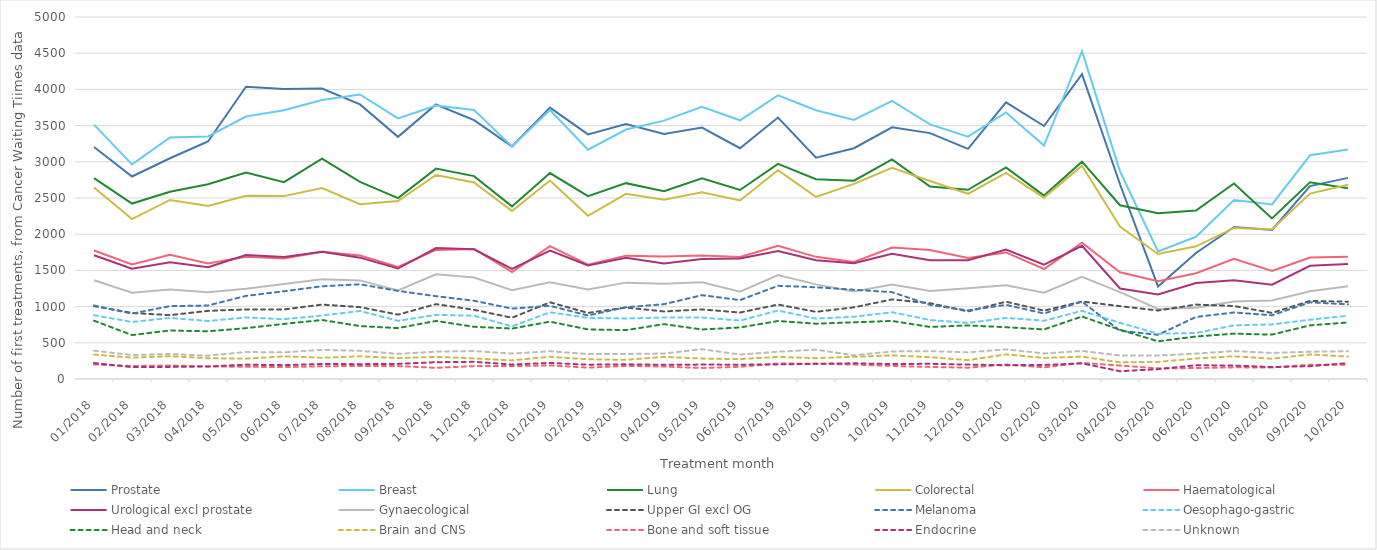
| Category | Prostate | Breast | Lung | Colorectal | Haematological | Urological excl prostate | Gynaecological | Upper GI excl OG | Melanoma | Oesophago-gastric | Head and neck | Brain and CNS | Bone and soft tissue | Endocrine | Unknown |
|---|---|---|---|---|---|---|---|---|---|---|---|---|---|---|---|
| 2018-01-01 | 3205 | 3514 | 2775 | 2646 | 1775 | 1709 | 1363 | 1007 | 1015 | 881 | 806 | 338 | 201 | 221 | 391 |
| 2018-02-01 | 2797 | 2965 | 2423 | 2208 | 1582 | 1522 | 1191 | 912 | 903 | 788 | 607 | 295 | 179 | 164 | 330 |
| 2018-03-01 | 3049 | 3335 | 2586 | 2473 | 1715 | 1614 | 1235 | 882 | 1006 | 843 | 670 | 315 | 187 | 167 | 345 |
| 2018-04-01 | 3280 | 3350 | 2690 | 2391 | 1596 | 1543 | 1198 | 941 | 1015 | 801 | 659 | 287 | 173 | 173 | 322 |
| 2018-05-01 | 4037 | 3625 | 2852 | 2531 | 1687 | 1712 | 1246 | 961 | 1148 | 850 | 702 | 281 | 169 | 198 | 373 |
| 2018-06-01 | 4005 | 3711 | 2719 | 2526 | 1664 | 1684 | 1313 | 960 | 1212 | 826 | 761 | 313 | 164 | 191 | 368 |
| 2018-07-01 | 4012 | 3853 | 3044 | 2637 | 1757 | 1758 | 1377 | 1028 | 1281 | 877 | 815 | 294 | 176 | 207 | 403 |
| 2018-08-01 | 3793 | 3930 | 2722 | 2414 | 1706 | 1676 | 1362 | 993 | 1308 | 939 | 731 | 313 | 180 | 205 | 389 |
| 2018-09-01 | 3345 | 3600 | 2499 | 2458 | 1549 | 1526 | 1224 | 889 | 1217 | 804 | 703 | 289 | 179 | 209 | 347 |
| 2018-10-01 | 3792 | 3778 | 2906 | 2817 | 1783 | 1808 | 1446 | 1034 | 1144 | 886 | 802 | 306 | 154 | 232 | 378 |
| 2018-11-01 | 3575 | 3716 | 2802 | 2715 | 1796 | 1791 | 1401 | 956 | 1081 | 874 | 721 | 284 | 178 | 237 | 386 |
| 2018-12-01 | 3213 | 3212 | 2384 | 2319 | 1476 | 1520 | 1225 | 846 | 972 | 728 | 697 | 257 | 179 | 200 | 351 |
| 2019-01-01 | 3748 | 3716 | 2845 | 2741 | 1835 | 1774 | 1337 | 1059 | 1011 | 921 | 792 | 307 | 188 | 222 | 383 |
| 2019-02-01 | 3379 | 3167 | 2525 | 2254 | 1580 | 1568 | 1236 | 913 | 877 | 845 | 685 | 272 | 157 | 197 | 345 |
| 2019-03-01 | 3523 | 3446 | 2705 | 2558 | 1704 | 1673 | 1331 | 987 | 992 | 836 | 675 | 265 | 181 | 203 | 345 |
| 2019-04-01 | 3385 | 3569 | 2593 | 2475 | 1693 | 1597 | 1314 | 933 | 1033 | 849 | 758 | 306 | 172 | 196 | 352 |
| 2019-05-01 | 3473 | 3761 | 2772 | 2578 | 1707 | 1659 | 1337 | 961 | 1158 | 849 | 684 | 282 | 152 | 199 | 412 |
| 2019-06-01 | 3188 | 3573 | 2611 | 2466 | 1684 | 1663 | 1205 | 918 | 1090 | 807 | 712 | 275 | 169 | 198 | 337 |
| 2019-07-01 | 3611 | 3917 | 2971 | 2883 | 1840 | 1769 | 1436 | 1028 | 1287 | 946 | 801 | 305 | 214 | 202 | 377 |
| 2019-08-01 | 3058 | 3712 | 2759 | 2516 | 1687 | 1639 | 1307 | 928 | 1267 | 834 | 764 | 288 | 210 | 210 | 405 |
| 2019-09-01 | 3188 | 3579 | 2739 | 2695 | 1617 | 1599 | 1209 | 990 | 1233 | 860 | 783 | 307 | 200 | 217 | 328 |
| 2019-10-01 | 3477 | 3841 | 3033 | 2916 | 1815 | 1731 | 1304 | 1099 | 1199 | 922 | 802 | 326 | 180 | 206 | 381 |
| 2019-11-01 | 3396 | 3517 | 2658 | 2735 | 1782 | 1640 | 1214 | 1047 | 1024 | 815 | 719 | 302 | 167 | 210 | 385 |
| 2019-12-01 | 3179 | 3347 | 2614 | 2558 | 1672 | 1641 | 1252 | 933 | 947 | 774 | 740 | 260 | 156 | 199 | 369 |
| 2020-01-01 | 3820 | 3682 | 2923 | 2847 | 1748 | 1787 | 1294 | 1068 | 1024 | 844 | 715 | 340 | 201 | 190 | 409 |
| 2020-02-01 | 3494 | 3224 | 2533 | 2505 | 1519 | 1579 | 1193 | 944 | 905 | 805 | 685 | 291 | 161 | 194 | 353 |
| 2020-03-01 | 4211 | 4527 | 3002 | 2946 | 1882 | 1839 | 1410 | 1070 | 1068 | 941 | 863 | 309 | 223 | 216 | 388 |
| 2020-04-01 | 2690 | 2869 | 2400 | 2105 | 1474 | 1250 | 1201 | 1006 | 667 | 776 | 680 | 230 | 186 | 107 | 324 |
| 2020-05-01 | 1278 | 1762 | 2290 | 1726 | 1351 | 1167 | 967 | 946 | 610 | 626 | 521 | 236 | 147 | 136 | 323 |
| 2020-06-01 | 1740 | 1964 | 2326 | 1833 | 1461 | 1327 | 983 | 1028 | 857 | 635 | 587 | 283 | 151 | 190 | 351 |
| 2020-07-02 | 2099 | 2471 | 2701 | 2086 | 1661 | 1363 | 1069 | 1008 | 919 | 741 | 626 | 314 | 161 | 186 | 386 |
| 2020-08-01 | 2058 | 2412 | 2218 | 2067 | 1491 | 1302 | 1085 | 913 | 880 | 754 | 613 | 280 | 159 | 165 | 360 |
| 2020-09-02 | 2665 | 3090 | 2716 | 2561 | 1678 | 1564 | 1211 | 1078 | 1059 | 819 | 741 | 339 | 197 | 177 | 377 |
| 2020-10-01 | 2778 | 3170 | 2634 | 2682 | 1689 | 1587 | 1282 | 1068 | 1031 | 874 | 781 | 310 | 198 | 219 | 384 |